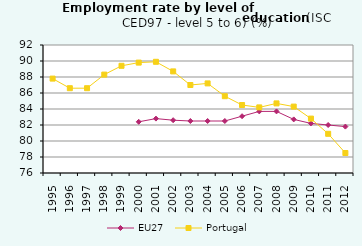
| Category | EU27 | Portugal |
|---|---|---|
| 1995.0 | 0 | 87.8 |
| 1996.0 | 0 | 86.6 |
| 1997.0 | 0 | 86.6 |
| 1998.0 | 0 | 88.3 |
| 1999.0 | 0 | 89.4 |
| 2000.0 | 82.4 | 89.8 |
| 2001.0 | 82.8 | 89.9 |
| 2002.0 | 82.6 | 88.7 |
| 2003.0 | 82.5 | 87 |
| 2004.0 | 82.5 | 87.2 |
| 2005.0 | 82.5 | 85.6 |
| 2006.0 | 83.1 | 84.5 |
| 2007.0 | 83.7 | 84.2 |
| 2008.0 | 83.7 | 84.7 |
| 2009.0 | 82.7 | 84.3 |
| 2010.0 | 82.2 | 82.8 |
| 2011.0 | 82 | 80.9 |
| 2012.0 | 81.8 | 78.5 |